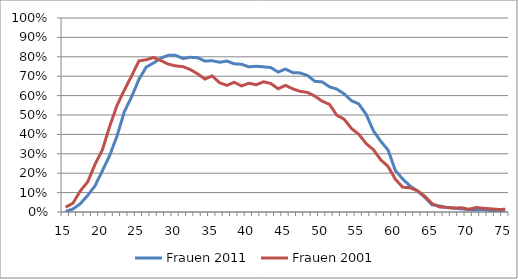
| Category | Frauen 2011 | Frauen 2001 |
|---|---|---|
| 15.0 | 0.003 | 0.025 |
| 16.0 | 0.015 | 0.045 |
| 17.0 | 0.043 | 0.109 |
| 18.0 | 0.085 | 0.155 |
| 19.0 | 0.135 | 0.245 |
| 20.0 | 0.212 | 0.319 |
| 21.0 | 0.291 | 0.44 |
| 22.0 | 0.391 | 0.549 |
| 23.0 | 0.516 | 0.628 |
| 24.0 | 0.594 | 0.702 |
| 25.0 | 0.684 | 0.779 |
| 26.0 | 0.747 | 0.785 |
| 27.0 | 0.768 | 0.797 |
| 28.0 | 0.793 | 0.78 |
| 29.0 | 0.808 | 0.762 |
| 30.0 | 0.808 | 0.753 |
| 31.0 | 0.791 | 0.749 |
| 32.0 | 0.798 | 0.734 |
| 33.0 | 0.795 | 0.712 |
| 34.0 | 0.778 | 0.685 |
| 35.0 | 0.78 | 0.702 |
| 36.0 | 0.772 | 0.666 |
| 37.0 | 0.778 | 0.653 |
| 38.0 | 0.764 | 0.669 |
| 39.0 | 0.762 | 0.65 |
| 40.0 | 0.748 | 0.664 |
| 41.0 | 0.751 | 0.656 |
| 42.0 | 0.748 | 0.671 |
| 43.0 | 0.744 | 0.662 |
| 44.0 | 0.721 | 0.635 |
| 45.0 | 0.737 | 0.653 |
| 46.0 | 0.718 | 0.635 |
| 47.0 | 0.717 | 0.622 |
| 48.0 | 0.704 | 0.616 |
| 49.0 | 0.674 | 0.598 |
| 50.0 | 0.671 | 0.571 |
| 51.0 | 0.645 | 0.555 |
| 52.0 | 0.634 | 0.499 |
| 53.0 | 0.609 | 0.478 |
| 54.0 | 0.574 | 0.431 |
| 55.0 | 0.557 | 0.401 |
| 56.0 | 0.504 | 0.353 |
| 57.0 | 0.418 | 0.321 |
| 58.0 | 0.365 | 0.269 |
| 59.0 | 0.319 | 0.235 |
| 60.0 | 0.213 | 0.168 |
| 61.0 | 0.17 | 0.128 |
| 62.0 | 0.134 | 0.125 |
| 63.0 | 0.109 | 0.11 |
| 64.0 | 0.076 | 0.081 |
| 65.0 | 0.037 | 0.043 |
| 66.0 | 0.031 | 0.026 |
| 67.0 | 0.024 | 0.023 |
| 68.0 | 0.02 | 0.02 |
| 69.0 | 0.016 | 0.022 |
| 70.0 | 0.012 | 0.014 |
| 71.0 | 0.011 | 0.023 |
| 72.0 | 0.013 | 0.019 |
| 73.0 | 0.006 | 0.016 |
| 74.0 | 0.007 | 0.013 |
| 75.0 | 0.007 | 0.014 |